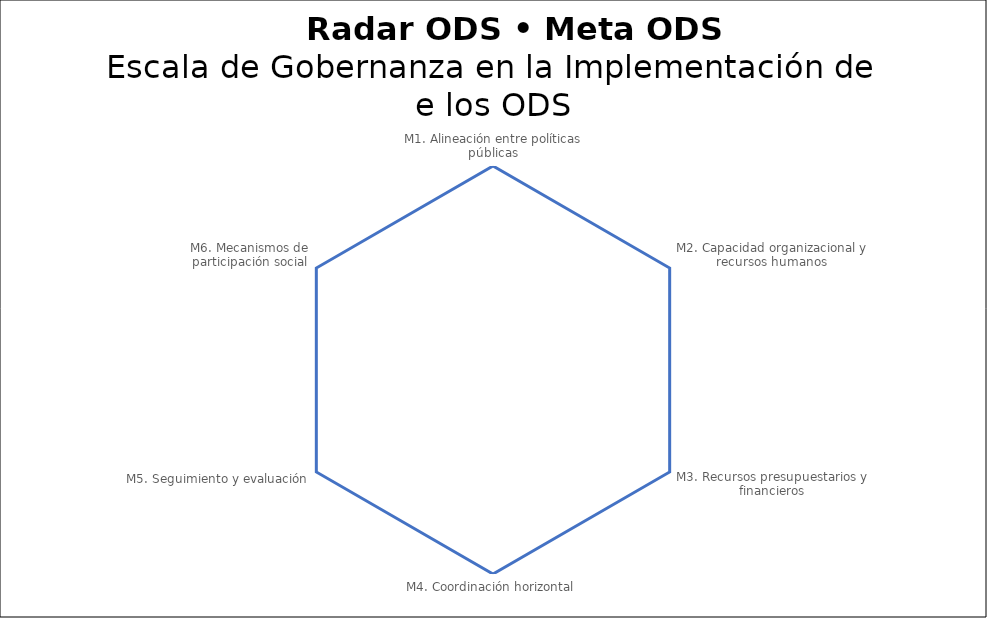
| Category | Series 0 |
|---|---|
| M1. Alineación entre políticas públicas | 0 |
| M2. Capacidad organizacional y recursos humanos | 0 |
| M3. Recursos presupuestarios y financieros | 0 |
| M4. Coordinación horizontal | 0 |
| M5. Seguimiento y evaluación | 0 |
| M6. Mecanismos de participación social | 0 |